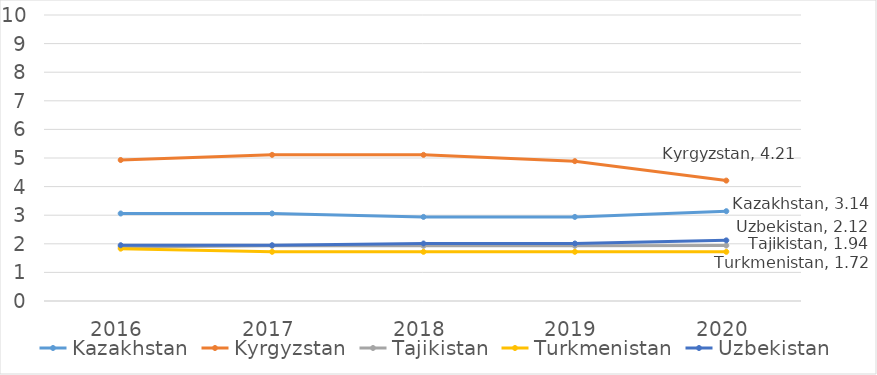
| Category | Kazakhstan | Kyrgyzstan | Tajikistan | Turkmenistan | Uzbekistan |
|---|---|---|---|---|---|
| 2016.0 | 3.06 | 4.93 | 1.89 | 1.83 | 1.95 |
| 2017.0 | 3.06 | 5.11 | 1.93 | 1.72 | 1.95 |
| 2018.0 | 2.94 | 5.11 | 1.93 | 1.72 | 2.01 |
| 2019.0 | 2.94 | 4.89 | 1.93 | 1.72 | 2.01 |
| 2020.0 | 3.14 | 4.21 | 1.94 | 1.72 | 2.12 |